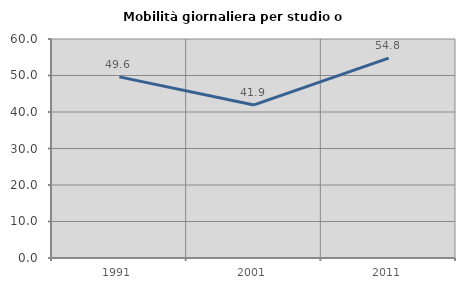
| Category | Mobilità giornaliera per studio o lavoro |
|---|---|
| 1991.0 | 49.618 |
| 2001.0 | 41.935 |
| 2011.0 | 54.777 |